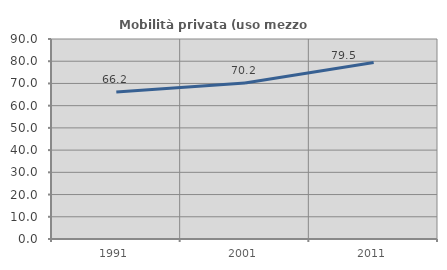
| Category | Mobilità privata (uso mezzo privato) |
|---|---|
| 1991.0 | 66.15 |
| 2001.0 | 70.175 |
| 2011.0 | 79.468 |